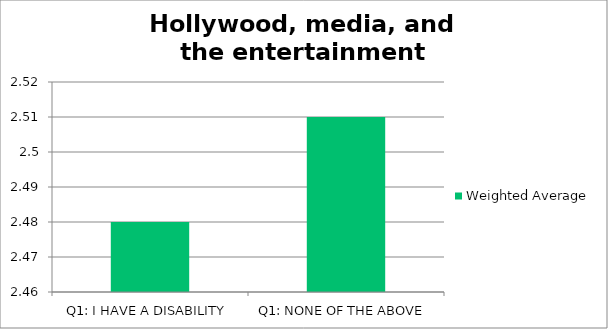
| Category | Weighted Average |
|---|---|
| Q1: I HAVE A DISABILITY | 2.48 |
| Q1: NONE OF THE ABOVE | 2.51 |